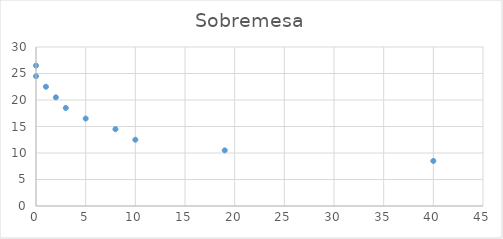
| Category | Sobremesa |
|---|---|
| 40.0 | 8.5 |
| 19.0 | 10.5 |
| 10.0 | 12.5 |
| 8.0 | 14.5 |
| 5.0 | 16.5 |
| 3.0 | 18.5 |
| 2.0 | 20.5 |
| 1.0 | 22.5 |
| 0.0 | 24.5 |
| 0.0 | 26.5 |